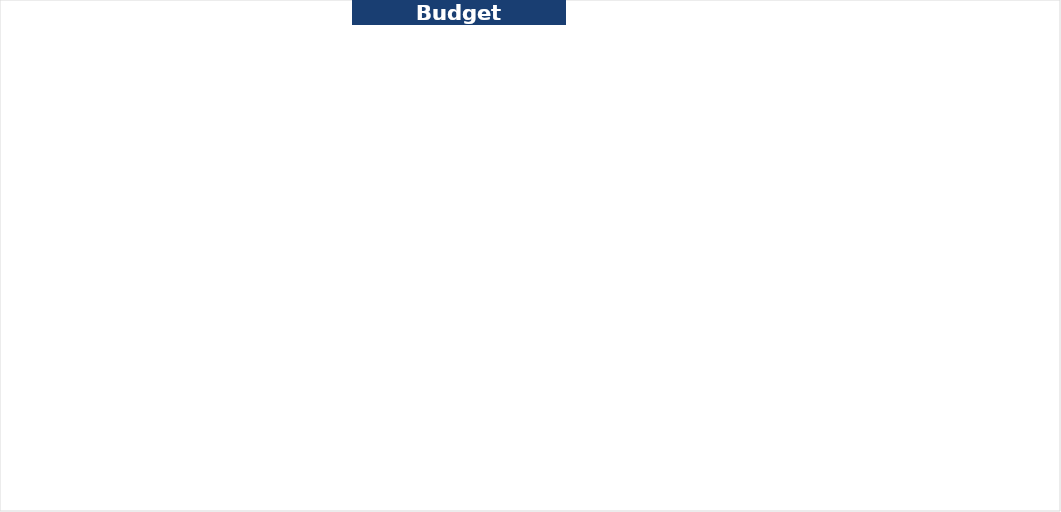
| Category | Series 0 |
|---|---|
| UK % allocation | 0 |
| LMICs % allocation | 0 |
| Other % allocation | 0 |